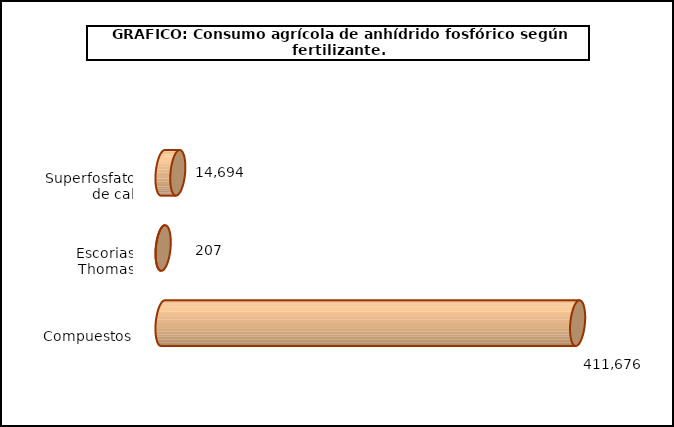
| Category | fert. N |
|---|---|
| 0 | 14694 |
| 1 | 207 |
| 2 | 411676 |